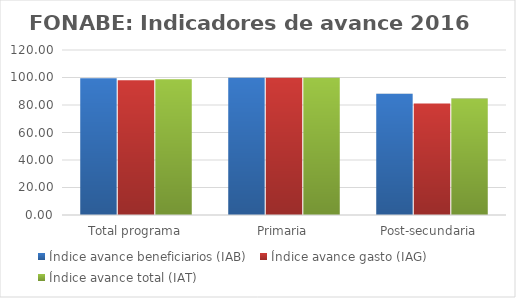
| Category | Índice avance beneficiarios (IAB)  | Índice avance gasto (IAG) | Índice avance total (IAT)  |
|---|---|---|---|
| Total programa | 99.472 | 97.941 | 98.707 |
| Primaria | 99.737 | 99.734 | 99.736 |
| Post-secundaria  | 88.132 | 81.182 | 84.657 |